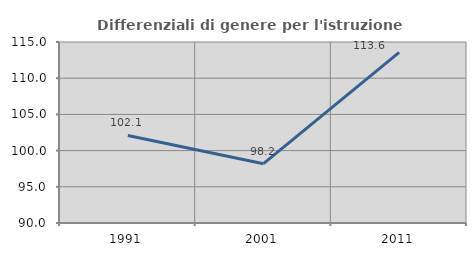
| Category | Differenziali di genere per l'istruzione superiore |
|---|---|
| 1991.0 | 102.093 |
| 2001.0 | 98.19 |
| 2011.0 | 113.562 |